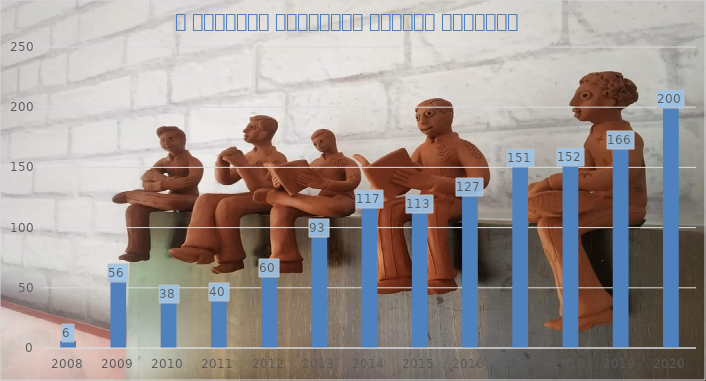
| Category | Publications |
|---|---|
| 2008 | 6 |
| 2009 | 56 |
| 2010 | 38 |
| 2011 | 40 |
| 2012 | 60 |
| 2013 | 93 |
| 2014 | 117 |
| 2015 | 113 |
| 2016 | 127 |
| 2017 | 151 |
| 2018 | 152 |
| 2019 | 166 |
| 2020 | 200 |